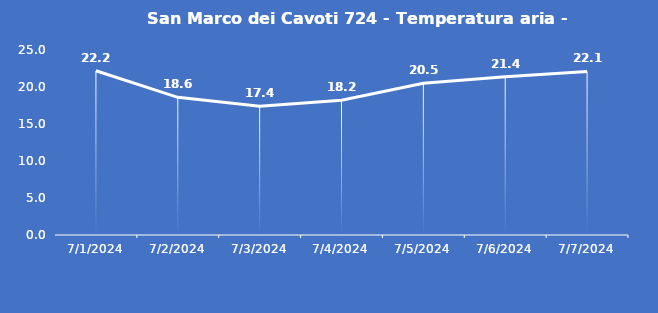
| Category | San Marco dei Cavoti 724 - Temperatura aria - Grezzo (°C) |
|---|---|
| 7/1/24 | 22.2 |
| 7/2/24 | 18.6 |
| 7/3/24 | 17.4 |
| 7/4/24 | 18.2 |
| 7/5/24 | 20.5 |
| 7/6/24 | 21.4 |
| 7/7/24 | 22.1 |